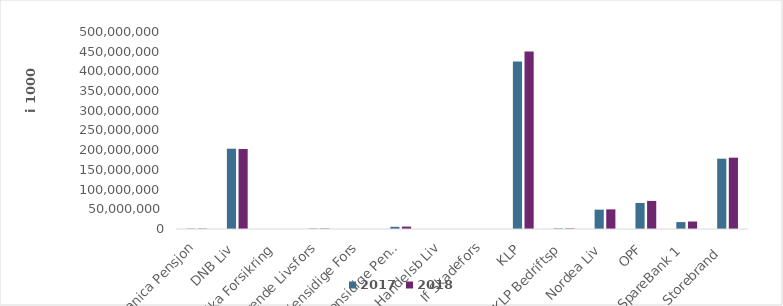
| Category | 2017 | 2018 |
|---|---|---|
| Danica Pensjon | 982925.819 | 1056297.566 |
| DNB Liv | 203821446 | 203084238.5 |
| Eika Forsikring | 0 | 0 |
| Frende Livsfors | 1045718 | 1166853 |
| Gjensidige Fors | 0 | 0 |
| Gjensidige Pensj | 5573380 | 6138522 |
| Handelsb Liv | 27115 | 23193 |
| If Skadefors | 0 | 0 |
| KLP | 425409512.871 | 450711574.444 |
| KLP Bedriftsp | 1459120 | 1517090 |
| Nordea Liv | 49076950 | 49831728.59 |
| OPF | 66115112 | 71272663 |
| SpareBank 1 | 17555674.02 | 18998939.186 |
| Storebrand  | 178438668.084 | 181070508.746 |